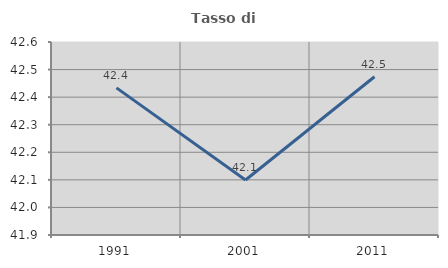
| Category | Tasso di occupazione   |
|---|---|
| 1991.0 | 42.434 |
| 2001.0 | 42.1 |
| 2011.0 | 42.474 |